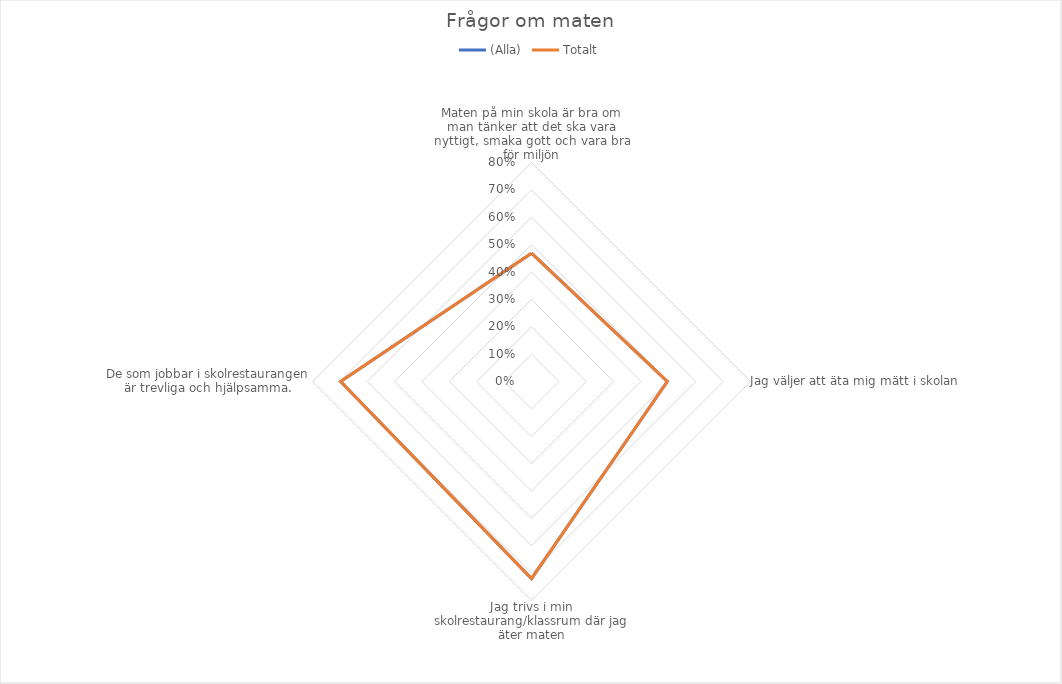
| Category | (Alla) | Totalt |
|---|---|---|
| Maten på min skola är bra om man tänker att det ska vara nyttigt, smaka gott och vara bra för miljön | 0.469 | 0.469 |
| Jag väljer att äta mig mätt i skolan | 0.496 | 0.496 |
| Jag trivs i min skolrestaurang/klassrum där jag äter maten | 0.72 | 0.72 |
| De som jobbar i skolrestaurangen är trevliga och hjälpsamma. | 0.697 | 0.697 |